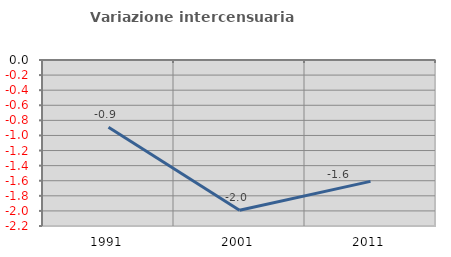
| Category | Variazione intercensuaria annua |
|---|---|
| 1991.0 | -0.892 |
| 2001.0 | -1.99 |
| 2011.0 | -1.609 |